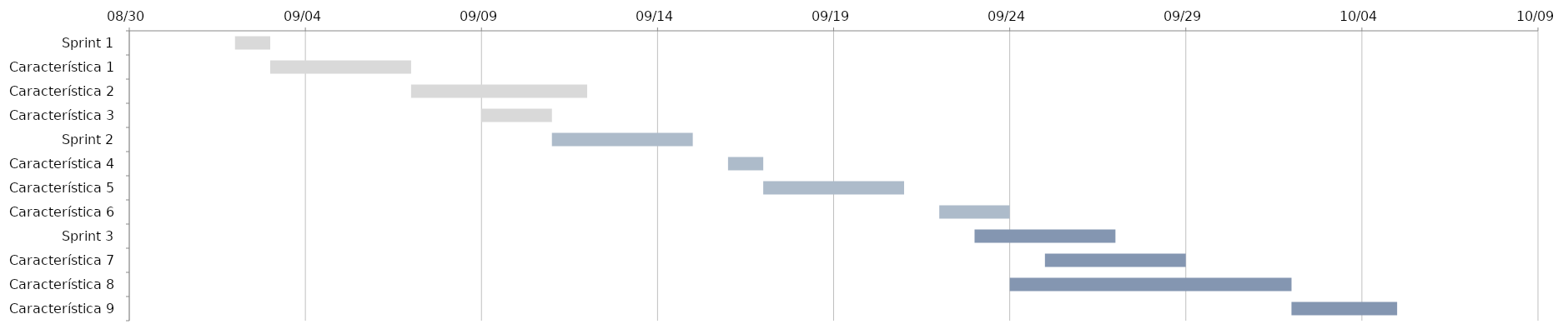
| Category | INICIO | DÍAS |
|---|---|---|
| Sprint 1 | 2022-09-02 | 1 |
| Característica 1 | 2022-09-03 | 4 |
| Característica 2 | 2022-09-07 | 5 |
| Característica 3 | 2022-09-09 | 2 |
| Sprint 2 | 2022-09-11 | 4 |
| Característica 4 | 2022-09-16 | 1 |
| Característica 5 | 2022-09-17 | 4 |
| Característica 6 | 2022-09-22 | 2 |
| Sprint 3 | 2022-09-23 | 4 |
| Característica 7 | 2022-09-25 | 4 |
| Característica 8 | 2022-09-24 | 8 |
| Característica 9 | 2022-10-02 | 3 |